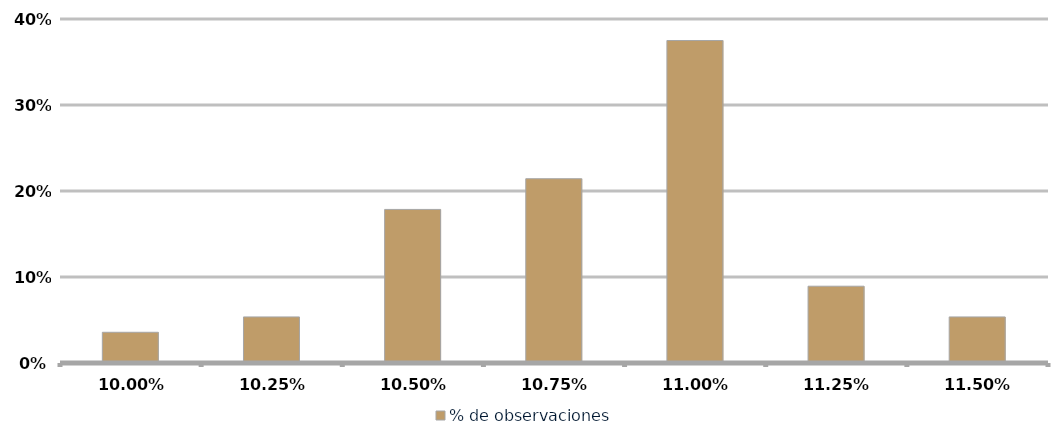
| Category | % de observaciones  |
|---|---|
| 0.09999999999999999 | 0.036 |
| 0.1025 | 0.054 |
| 0.105 | 0.179 |
| 0.1075 | 0.214 |
| 0.11 | 0.375 |
| 0.1125 | 0.089 |
| 0.115 | 0.054 |